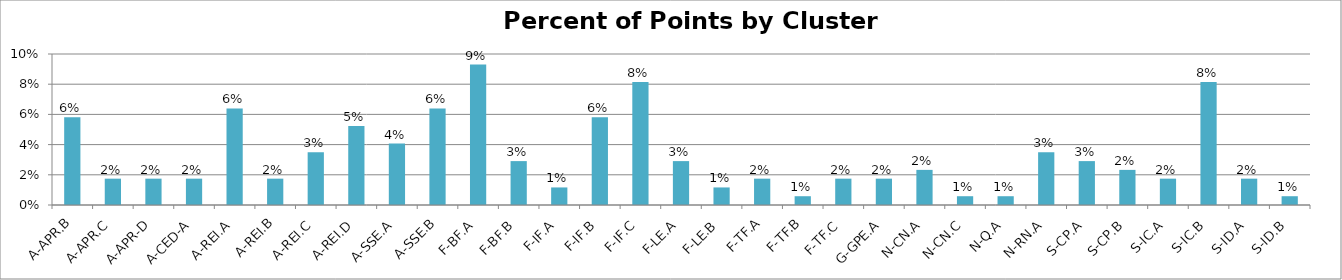
| Category | Percent |
|---|---|
| A-APR.B | 0.058 |
| A-APR.C | 0.017 |
| A-APR-D | 0.017 |
| A-CED-A | 0.017 |
| A-REI.A | 0.064 |
| A-REI.B | 0.017 |
| A-REI.C | 0.035 |
| A-REI.D | 0.052 |
| A-SSE.A | 0.041 |
| A-SSE.B | 0.064 |
| F-BF.A | 0.093 |
| F-BF.B | 0.029 |
| F-IF.A | 0.012 |
| F-IF.B | 0.058 |
| F-IF.C | 0.081 |
| F-LE.A | 0.029 |
| F-LE.B | 0.012 |
| F-TF.A | 0.017 |
| F-TF.B | 0.006 |
| F-TF.C | 0.017 |
| G-GPE.A | 0.017 |
| N-CN.A | 0.023 |
| N-CN.C | 0.006 |
| N-Q.A | 0.006 |
| N-RN.A | 0.035 |
| S-CP.A | 0.029 |
| S-CP.B | 0.023 |
| S-IC.A | 0.017 |
| S-IC.B | 0.081 |
| S-ID.A | 0.017 |
| S-ID.B | 0.006 |